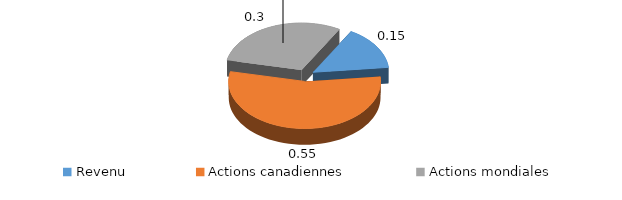
| Category | Series 0 |
|---|---|
| Revenu | 0.15 |
| Actions canadiennes | 0.55 |
| Actions mondiales | 0.3 |